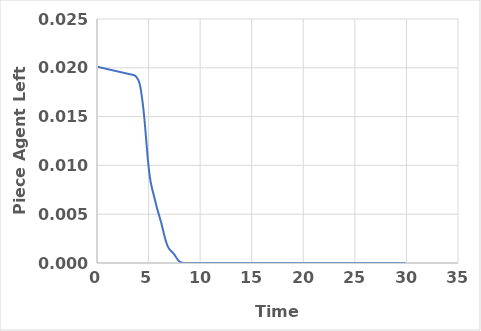
| Category | Series 0 |
|---|---|
| 0.083333 | 0.02 |
| 0.216667 | 0.02 |
| 0.35 | 0.02 |
| 0.483333 | 0.02 |
| 0.616667 | 0.02 |
| 0.75 | 0.02 |
| 0.883333 | 0.02 |
| 1.016667 | 0.02 |
| 1.15 | 0.02 |
| 1.283333 | 0.02 |
| 1.416667 | 0.02 |
| 1.55 | 0.02 |
| 1.683333 | 0.02 |
| 1.816667 | 0.02 |
| 1.95 | 0.02 |
| 2.083333 | 0.02 |
| 2.216667 | 0.02 |
| 2.35 | 0.02 |
| 2.483333 | 0.02 |
| 2.616667 | 0.019 |
| 2.75 | 0.019 |
| 2.883333 | 0.019 |
| 3.016667 | 0.019 |
| 3.15 | 0.019 |
| 3.283333 | 0.019 |
| 3.416667 | 0.019 |
| 3.55 | 0.019 |
| 3.651608 | 0.019 |
| 3.764653 | 0.019 |
| 3.853676 | 0.019 |
| 3.952225 | 0.019 |
| 4.039196 | 0.019 |
| 4.123204 | 0.018 |
| 4.216447 | 0.018 |
| 4.312686 | 0.017 |
| 4.405232 | 0.017 |
| 4.496002 | 0.016 |
| 4.579882 | 0.015 |
| 4.669063 | 0.014 |
| 4.759562 | 0.013 |
| 4.847732 | 0.012 |
| 4.938367 | 0.011 |
| 5.026729 | 0.01 |
| 5.111294 | 0.009 |
| 5.201646 | 0.008 |
| 5.298879 | 0.008 |
| 5.383223 | 0.007 |
| 5.478783 | 0.007 |
| 5.577913 | 0.007 |
| 5.662772 | 0.006 |
| 5.749023 | 0.006 |
| 5.832629 | 0.006 |
| 5.921524 | 0.005 |
| 6.010866 | 0.005 |
| 6.105264 | 0.005 |
| 6.196528 | 0.004 |
| 6.283982 | 0.004 |
| 6.37537 | 0.003 |
| 6.468089 | 0.003 |
| 6.555451 | 0.003 |
| 6.641434 | 0.002 |
| 6.727083 | 0.002 |
| 6.817699 | 0.002 |
| 6.90835 | 0.002 |
| 6.99808 | 0.001 |
| 7.094275 | 0.001 |
| 7.177859 | 0.001 |
| 7.270849 | 0.001 |
| 7.36107 | 0.001 |
| 7.45452 | 0.001 |
| 7.543275 | 0.001 |
| 7.63261 | 0.001 |
| 7.721051 | 0.001 |
| 7.817759 | 0 |
| 7.908407 | 0 |
| 8.00531 | 0 |
| 8.088977 | 0 |
| 8.172987 | 0 |
| 8.264503 | 0 |
| 8.357912 | 0 |
| 8.443017 | 0 |
| 8.529386 | 0 |
| 8.621038 | 0 |
| 8.711548 | 0 |
| 8.802643 | 0 |
| 8.89603 | 0 |
| 8.980555 | 0 |
| 9.068045 | 0 |
| 9.151605 | 0 |
| 9.23615 | 0 |
| 9.32333 | 0 |
| 9.407021 | 0 |
| 9.493634 | 0 |
| 9.589421 | 0 |
| 9.683439 | 0 |
| 9.766894 | 0 |
| 9.850762 | 0 |
| 9.934553 | 0 |
| 10.02518 | 0 |
| 10.10902 | 0 |
| 10.19811 | 0 |
| 10.28235 | 0 |
| 10.36839 | 0 |
| 10.45562 | 0 |
| 10.5511 | 0 |
| 10.64149 | 0 |
| 10.73146 | 0 |
| 10.81736 | 0 |
| 10.90107 | 0 |
| 10.98649 | 0 |
| 11.07934 | 0 |
| 11.16476 | 0 |
| 11.25277 | 0 |
| 11.35173 | 0 |
| 11.44128 | 0 |
| 11.53437 | 0 |
| 11.62191 | 0 |
| 11.70612 | 0 |
| 11.79839 | 0 |
| 11.88195 | 0 |
| 11.97012 | 0 |
| 12.05402 | 0 |
| 12.14833 | 0 |
| 12.23678 | 0 |
| 12.32114 | 0 |
| 12.40902 | 0 |
| 12.50058 | 0 |
| 12.59392 | 0 |
| 12.68547 | 0 |
| 12.77748 | 0 |
| 12.86863 | 0 |
| 12.95854 | 0 |
| 13.04247 | 0 |
| 13.13471 | 0 |
| 13.22604 | 0 |
| 13.31339 | 0 |
| 13.40176 | 0 |
| 13.48578 | 0 |
| 13.57327 | 0 |
| 13.6604 | 0 |
| 13.7489 | 0 |
| 13.83677 | 0 |
| 13.92028 | 0 |
| 14.00469 | 0 |
| 14.08845 | 0 |
| 14.17884 | 0 |
| 14.27257 | 0 |
| 14.35617 | 0 |
| 14.44686 | 0 |
| 14.5343 | 0 |
| 14.62329 | 0 |
| 14.7072 | 0 |
| 14.79474 | 0 |
| 14.87846 | 0 |
| 14.96418 | 0 |
| 15.04866 | 0 |
| 15.13743 | 0 |
| 15.22836 | 0 |
| 15.3123 | 0 |
| 15.39708 | 0 |
| 15.48337 | 0 |
| 15.57232 | 0 |
| 15.65804 | 0 |
| 15.74904 | 0 |
| 15.83244 | 0 |
| 15.93061 | 0 |
| 16.01527 | 0 |
| 16.0994 | 0 |
| 16.19026 | 0 |
| 16.28279 | 0 |
| 16.37402 | 0 |
| 16.46761 | 0 |
| 16.56146 | 0 |
| 16.6468 | 0 |
| 16.73414 | 0 |
| 16.81964 | 0 |
| 16.90347 | 0 |
| 16.99719 | 0 |
| 17.0817 | 0 |
| 17.17105 | 0 |
| 17.26166 | 0 |
| 17.34693 | 0 |
| 17.4339 | 0 |
| 17.51729 | 0 |
| 17.60227 | 0 |
| 17.69317 | 0 |
| 17.78238 | 0 |
| 17.86623 | 0 |
| 17.95016 | 0 |
| 18.04497 | 0 |
| 18.13892 | 0 |
| 18.22912 | 0 |
| 18.31791 | 0 |
| 18.40507 | 0 |
| 18.49839 | 0 |
| 18.58203 | 0 |
| 18.67745 | 0 |
| 18.76856 | 0 |
| 18.86826 | 0 |
| 18.96384 | 0 |
| 19.04984 | 0 |
| 19.14011 | 0 |
| 19.22394 | 0 |
| 19.31093 | 0 |
| 19.40318 | 0 |
| 19.48831 | 0 |
| 19.5743 | 0 |
| 19.66508 | 0 |
| 19.75251 | 0 |
| 19.83771 | 0 |
| 19.9292 | 0 |
| 20.01631 | 0 |
| 20.10559 | 0 |
| 20.18912 | 0 |
| 20.27547 | 0 |
| 20.36063 | 0 |
| 20.44635 | 0 |
| 20.53487 | 0 |
| 20.61853 | 0 |
| 20.7068 | 0 |
| 20.79587 | 0 |
| 20.88077 | 0 |
| 20.9646 | 0 |
| 21.05305 | 0 |
| 21.14849 | 0 |
| 21.23948 | 0 |
| 21.32325 | 0 |
| 21.40773 | 0 |
| 21.49283 | 0 |
| 21.5765 | 0 |
| 21.66529 | 0 |
| 21.7512 | 0 |
| 21.83946 | 0 |
| 21.92283 | 0 |
| 22.00631 | 0 |
| 22.09014 | 0 |
| 22.17538 | 0 |
| 22.26282 | 0 |
| 22.35732 | 0 |
| 22.44178 | 0 |
| 22.52708 | 0 |
| 22.61069 | 0 |
| 22.69623 | 0 |
| 22.78012 | 0 |
| 22.86512 | 0 |
| 22.95155 | 0 |
| 23.03863 | 0 |
| 23.12197 | 0 |
| 23.21152 | 0 |
| 23.30344 | 0 |
| 23.38787 | 0 |
| 23.47518 | 0 |
| 23.55863 | 0 |
| 23.6485 | 0 |
| 23.7374 | 0 |
| 23.83134 | 0 |
| 23.91572 | 0 |
| 23.99924 | 0 |
| 24.08372 | 0 |
| 24.17505 | 0 |
| 24.26601 | 0 |
| 24.35084 | 0 |
| 24.44045 | 0 |
| 24.53254 | 0 |
| 24.61659 | 0 |
| 24.70633 | 0 |
| 24.79471 | 0 |
| 24.87921 | 0 |
| 24.96666 | 0 |
| 25.05026 | 0 |
| 25.13475 | 0 |
| 25.22349 | 0 |
| 25.313 | 0 |
| 25.40228 | 0 |
| 25.48996 | 0 |
| 25.57593 | 0 |
| 25.66563 | 0 |
| 25.75086 | 0 |
| 25.83966 | 0 |
| 25.92316 | 0 |
| 26.01063 | 0 |
| 26.09452 | 0 |
| 26.18108 | 0 |
| 26.27701 | 0 |
| 26.3704 | 0 |
| 26.4567 | 0 |
| 26.54129 | 0 |
| 26.63096 | 0 |
| 26.72042 | 0 |
| 26.81135 | 0 |
| 26.89597 | 0 |
| 26.98836 | 0 |
| 27.0788 | 0 |
| 27.16592 | 0 |
| 27.24957 | 0 |
| 27.33965 | 0 |
| 27.42708 | 0 |
| 27.52144 | 0 |
| 27.61075 | 0 |
| 27.70455 | 0 |
| 27.79347 | 0 |
| 27.88023 | 0 |
| 27.96749 | 0 |
| 28.05288 | 0 |
| 28.14179 | 0 |
| 28.23176 | 0 |
| 28.31725 | 0 |
| 28.4023 | 0 |
| 28.48983 | 0 |
| 28.58012 | 0 |
| 28.66687 | 0 |
| 28.75193 | 0 |
| 28.83921 | 0 |
| 28.93028 | 0 |
| 29.01641 | 0 |
| 29.1094 | 0 |
| 29.19745 | 0 |
| 29.2867 | 0 |
| 29.37945 | 0 |
| 29.4718 | 0 |
| 29.56454 | 0 |
| 29.64986 | 0 |
| 29.73968 | 0 |
| 29.82838 | 0 |
| 29.91399 | 0 |